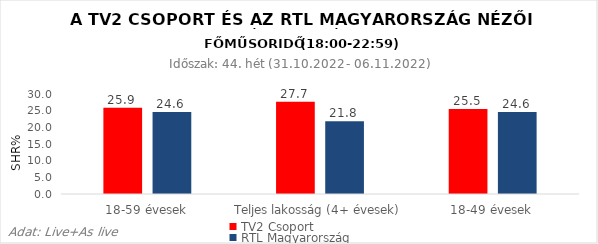
| Category | TV2 Csoport | RTL Magyarország |
|---|---|---|
| 18-59 évesek | 25.9 | 24.6 |
| Teljes lakosság (4+ évesek) | 27.7 | 21.8 |
| 18-49 évesek | 25.5 | 24.6 |